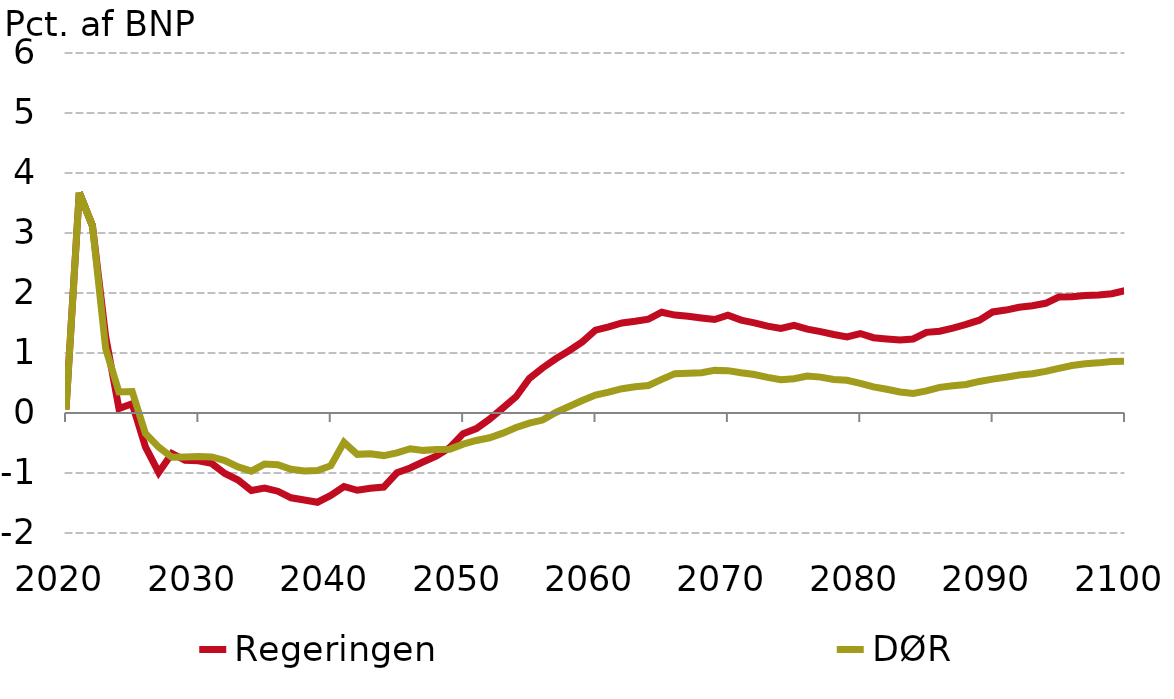
| Category |  Regeringen |  DØR |
|---|---|---|
| 0 | 0.056 | 0.056 |
| 1 | 3.673 | 3.673 |
| 2 | 3.118 | 3.118 |
| 3 | 1.267 | 1.069 |
| 4 | 0.074 | 0.35 |
| 5 | 0.153 | 0.357 |
| 6 | -0.564 | -0.342 |
| 7 | -0.991 | -0.569 |
| 8 | -0.674 | -0.738 |
| 9 | -0.789 | -0.733 |
| 10 | -0.797 | -0.723 |
| 11 | -0.84 | -0.733 |
| 12 | -1.008 | -0.792 |
| 13 | -1.118 | -0.898 |
| 14 | -1.292 | -0.969 |
| 15 | -1.25 | -0.852 |
| 16 | -1.303 | -0.862 |
| 17 | -1.413 | -0.939 |
| 18 | -1.449 | -0.966 |
| 19 | -1.487 | -0.959 |
| 20 | -1.375 | -0.878 |
| 21 | -1.225 | -0.489 |
| 22 | -1.288 | -0.689 |
| 23 | -1.253 | -0.68 |
| 24 | -1.234 | -0.71 |
| 25 | -0.997 | -0.664 |
| 26 | -0.916 | -0.596 |
| 27 | -0.813 | -0.623 |
| 28 | -0.715 | -0.607 |
| 29 | -0.575 | -0.602 |
| 30 | -0.344 | -0.52 |
| 31 | -0.26 | -0.458 |
| 32 | -0.103 | -0.413 |
| 33 | 0.083 | -0.336 |
| 34 | 0.272 | -0.242 |
| 35 | 0.575 | -0.17 |
| 36 | 0.75 | -0.118 |
| 37 | 0.904 | 0.009 |
| 38 | 1.037 | 0.107 |
| 39 | 1.186 | 0.209 |
| 40 | 1.381 | 0.299 |
| 41 | 1.437 | 0.348 |
| 42 | 1.5 | 0.405 |
| 43 | 1.53 | 0.438 |
| 44 | 1.565 | 0.458 |
| 45 | 1.68 | 0.561 |
| 46 | 1.632 | 0.656 |
| 47 | 1.611 | 0.663 |
| 48 | 1.583 | 0.672 |
| 49 | 1.558 | 0.71 |
| 50 | 1.632 | 0.706 |
| 51 | 1.548 | 0.671 |
| 52 | 1.503 | 0.642 |
| 53 | 1.448 | 0.594 |
| 54 | 1.409 | 0.554 |
| 55 | 1.461 | 0.57 |
| 56 | 1.397 | 0.615 |
| 57 | 1.356 | 0.598 |
| 58 | 1.308 | 0.559 |
| 59 | 1.269 | 0.544 |
| 60 | 1.325 | 0.495 |
| 61 | 1.255 | 0.435 |
| 62 | 1.233 | 0.396 |
| 63 | 1.216 | 0.35 |
| 64 | 1.234 | 0.325 |
| 65 | 1.345 | 0.369 |
| 66 | 1.362 | 0.428 |
| 67 | 1.416 | 0.455 |
| 68 | 1.477 | 0.475 |
| 69 | 1.547 | 0.526 |
| 70 | 1.685 | 0.565 |
| 71 | 1.716 | 0.597 |
| 72 | 1.762 | 0.634 |
| 73 | 1.788 | 0.655 |
| 74 | 1.828 | 0.694 |
| 75 | 1.932 | 0.742 |
| 76 | 1.937 | 0.792 |
| 77 | 1.958 | 0.82 |
| 78 | 1.968 | 0.836 |
| 79 | 1.989 | 0.859 |
| 80 | 2.038 | 0.865 |